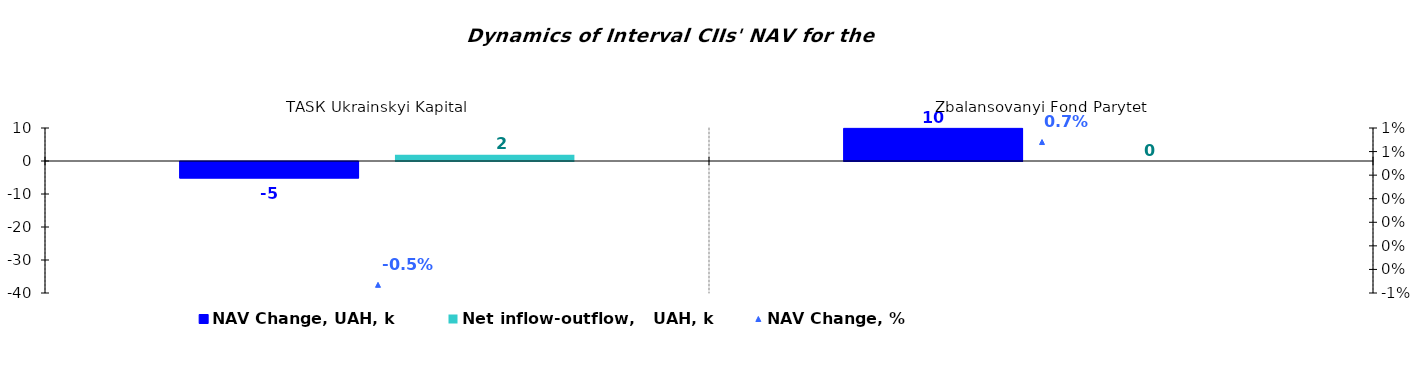
| Category | NAV Change, UAH, k | Net inflow-outflow,   UAH, k |
|---|---|---|
| ТАSК Ukrainskyi Kapital | -5.021 | 1.903 |
| Zbalansovanyi Fond Parytet | 9.889 | 0 |